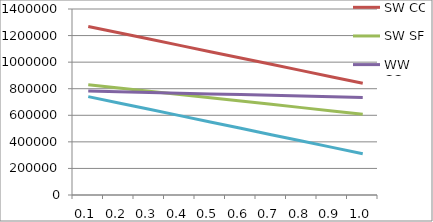
| Category | SW CC | SW SF | WW CCr | WW CCnr |
|---|---|---|---|---|
| 0.1 | 1268719.518 | 830505.787 | 782834.393 | 740536.229 |
| 0.2 | 1221193.982 | 805809.009 | 777398.316 | 692801.987 |
| 0.3 | 1173668.445 | 781112.231 | 771962.239 | 645067.745 |
| 0.4 | 1126142.909 | 756415.454 | 766526.161 | 597333.504 |
| 0.5 | 1078617.372 | 731718.676 | 761090.084 | 549599.262 |
| 0.6 | 1031091.836 | 707021.899 | 755654.007 | 501865.02 |
| 0.7 | 983566.299 | 682325.121 | 750217.929 | 454130.778 |
| 0.8 | 936040.763 | 657628.343 | 744781.852 | 406396.536 |
| 0.9 | 888515.226 | 632931.566 | 739345.775 | 358662.294 |
| 1.0 | 840989.69 | 608234.788 | 733909.697 | 310928.053 |